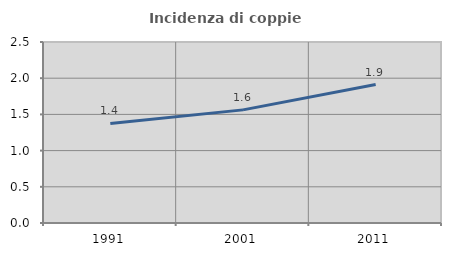
| Category | Incidenza di coppie miste |
|---|---|
| 1991.0 | 1.375 |
| 2001.0 | 1.562 |
| 2011.0 | 1.913 |